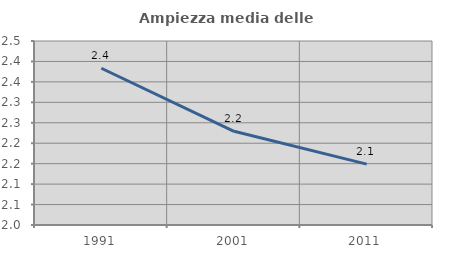
| Category | Ampiezza media delle famiglie |
|---|---|
| 1991.0 | 2.383 |
| 2001.0 | 2.229 |
| 2011.0 | 2.149 |